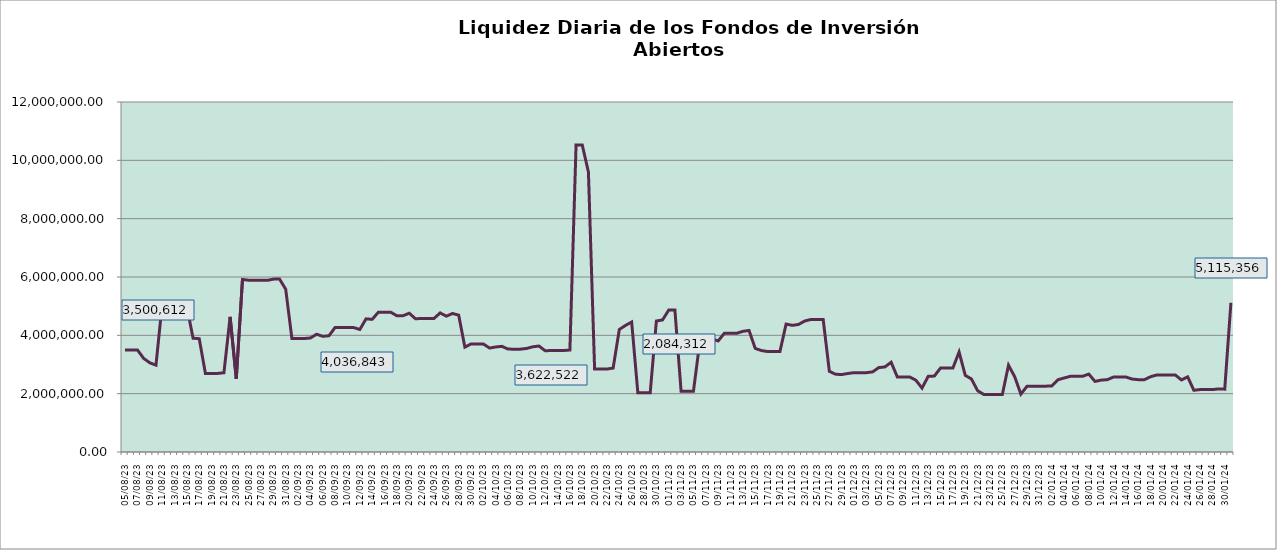
| Category | Liquidez |
|---|---|
| 2023-08-05 | 3500611.87 |
| 2023-08-06 | 3500354.64 |
| 2023-08-07 | 3500097.45 |
| 2023-08-08 | 3210366.89 |
| 2023-08-09 | 3058007.38 |
| 2023-08-10 | 2978560.19 |
| 2023-08-11 | 5066410.64 |
| 2023-08-12 | 5066038.5 |
| 2023-08-13 | 5065666.44 |
| 2023-08-14 | 5155723.09 |
| 2023-08-15 | 4985776.26 |
| 2023-08-16 | 3901327.34 |
| 2023-08-17 | 3885292.7 |
| 2023-08-18 | 2695387.55 |
| 2023-08-19 | 2695189.68 |
| 2023-08-20 | 2694991.84 |
| 2023-08-21 | 2716793.76 |
| 2023-08-22 | 4634977.84 |
| 2023-08-23 | 2511407.6 |
| 2023-08-24 | 5914568.84 |
| 2023-08-25 | 5889630.33 |
| 2023-08-26 | 5889198.19 |
| 2023-08-27 | 5888766.09 |
| 2023-08-28 | 5884515.02 |
| 2023-08-29 | 5926591.84 |
| 2023-08-30 | 5931501.64 |
| 2023-08-31 | 5580057.74 |
| 2023-09-01 | 3892644.21 |
| 2023-09-02 | 3892358.73 |
| 2023-09-03 | 3892073.31 |
| 2023-09-04 | 3908903.28 |
| 2023-09-05 | 4036842.93 |
| 2023-09-06 | 3965911.15 |
| 2023-09-07 | 3984917.66 |
| 2023-09-08 | 4271911.78 |
| 2023-09-09 | 4271598.63 |
| 2023-09-10 | 4271285.58 |
| 2023-09-11 | 4265619.54 |
| 2023-09-12 | 4201445.83 |
| 2023-09-13 | 4564803.62 |
| 2023-09-14 | 4547943.86 |
| 2023-09-15 | 4793327.23 |
| 2023-09-16 | 4792917.57 |
| 2023-09-17 | 4792507.95 |
| 2023-09-18 | 4670390.41 |
| 2023-09-19 | 4672628.79 |
| 2023-09-20 | 4757974.91 |
| 2023-09-21 | 4568679.81 |
| 2023-09-22 | 4578069.45 |
| 2023-09-23 | 4577678.42 |
| 2023-09-24 | 4577287.46 |
| 2023-09-25 | 4768442.27 |
| 2023-09-26 | 4656041.24 |
| 2023-09-27 | 4749440.99 |
| 2023-09-28 | 4691215.04 |
| 2023-09-29 | 3594829.12 |
| 2023-09-30 | 3705131.39 |
| 2023-10-01 | 3704830.2 |
| 2023-10-02 | 3702299.07 |
| 2023-10-03 | 3563604.91 |
| 2023-10-04 | 3601766.17 |
| 2023-10-05 | 3622522.29 |
| 2023-10-06 | 3527179.42 |
| 2023-10-07 | 3526892.83 |
| 2023-10-08 | 3526606.27 |
| 2023-10-09 | 3549867.98 |
| 2023-10-10 | 3607916.07 |
| 2023-10-11 | 3632777.48 |
| 2023-10-12 | 3470821.4 |
| 2023-10-13 | 3480438.7 |
| 2023-10-14 | 3480170.23 |
| 2023-10-15 | 3479901.75 |
| 2023-10-16 | 3496944.65 |
| 2023-10-17 | 10529377.51 |
| 2023-10-18 | 10527427.59 |
| 2023-10-19 | 9598279.41 |
| 2023-10-20 | 2843795.49 |
| 2023-10-21 | 2843576.21 |
| 2023-10-22 | 2843356.97 |
| 2023-10-23 | 2877543.06 |
| 2023-10-24 | 4199796.46 |
| 2023-10-25 | 4339276.81 |
| 2023-10-26 | 4455991.46 |
| 2023-10-27 | 2029862.19 |
| 2023-10-28 | 2029705.75 |
| 2023-10-29 | 2029549.34 |
| 2023-10-30 | 4491312.09 |
| 2023-10-31 | 4528124.94 |
| 2023-11-01 | 4866315.82 |
| 2023-11-02 | 4865940.97 |
| 2023-11-03 | 2084311.74 |
| 2023-11-04 | 2084151.19 |
| 2023-11-05 | 2083990.68 |
| 2023-11-06 | 3727221.54 |
| 2023-11-07 | 3752037.55 |
| 2023-11-08 | 3875044.89 |
| 2023-11-09 | 3807636.9 |
| 2023-11-10 | 4070553.01 |
| 2023-11-11 | 4070322.09 |
| 2023-11-12 | 4070091.24 |
| 2023-11-13 | 4137469.64 |
| 2023-11-14 | 4166581.56 |
| 2023-11-15 | 3552454.63 |
| 2023-11-16 | 3478407.46 |
| 2023-11-17 | 3445309.06 |
| 2023-11-18 | 3445113.71 |
| 2023-11-19 | 3444918.35 |
| 2023-11-20 | 4386196.81 |
| 2023-11-21 | 4342385.83 |
| 2023-11-22 | 4372626.66 |
| 2023-11-23 | 4489820.31 |
| 2023-11-24 | 4544220.56 |
| 2023-11-25 | 4543962.98 |
| 2023-11-26 | 4543705.44 |
| 2023-11-27 | 2766288.53 |
| 2023-11-28 | 2665717.08 |
| 2023-11-29 | 2656380.27 |
| 2023-11-30 | 2691860.79 |
| 2023-12-01 | 2720262.81 |
| 2023-12-02 | 2720108.68 |
| 2023-12-03 | 2719954.59 |
| 2023-12-04 | 2746705.4 |
| 2023-12-05 | 2894133.5 |
| 2023-12-06 | 2916814.53 |
| 2023-12-07 | 3077187.61 |
| 2023-12-08 | 2573849.69 |
| 2023-12-09 | 2573703.91 |
| 2023-12-10 | 2573558.18 |
| 2023-12-11 | 2461459.62 |
| 2023-12-12 | 2190702.84 |
| 2023-12-13 | 2593963.56 |
| 2023-12-14 | 2603847 |
| 2023-12-15 | 2880624.68 |
| 2023-12-16 | 2880496.53 |
| 2023-12-17 | 2880368.4 |
| 2023-12-18 | 3427569.02 |
| 2023-12-19 | 2626945.09 |
| 2023-12-20 | 2503393.87 |
| 2023-12-21 | 2102165.32 |
| 2023-12-22 | 1971821.96 |
| 2023-12-23 | 1971734.3 |
| 2023-12-24 | 1971646.63 |
| 2023-12-25 | 1971558.94 |
| 2023-12-26 | 2974522.85 |
| 2023-12-27 | 2581700.12 |
| 2023-12-28 | 1984714.53 |
| 2023-12-29 | 2254994.88 |
| 2023-12-30 | 2254894.64 |
| 2023-12-31 | 2258082.15 |
| 2024-01-01 | 2257981.74 |
| 2024-01-02 | 2260561.99 |
| 2024-01-03 | 2476883.36 |
| 2024-01-04 | 2537478.87 |
| 2024-01-05 | 2594369.41 |
| 2024-01-06 | 2597486.32 |
| 2024-01-07 | 2597370.86 |
| 2024-01-08 | 2670959.38 |
| 2024-01-09 | 2420194.27 |
| 2024-01-10 | 2464449.75 |
| 2024-01-11 | 2479715.02 |
| 2024-01-12 | 2570593.12 |
| 2024-01-13 | 2570447.79 |
| 2024-01-14 | 2570302.43 |
| 2024-01-15 | 2501292.9 |
| 2024-01-16 | 2479569.79 |
| 2024-01-17 | 2480836.22 |
| 2024-01-18 | 2580722.87 |
| 2024-01-19 | 2641102.41 |
| 2024-01-20 | 2640953.13 |
| 2024-01-21 | 2640803.88 |
| 2024-01-22 | 2641058.29 |
| 2024-01-23 | 2469288.05 |
| 2024-01-24 | 2576946.84 |
| 2024-01-25 | 2116401.3 |
| 2024-01-26 | 2140122.93 |
| 2024-01-27 | 2140002.04 |
| 2024-01-28 | 2139881.12 |
| 2024-01-29 | 2162716.43 |
| 2024-01-30 | 2155182.85 |
| 2024-01-31 | 5115356.31 |